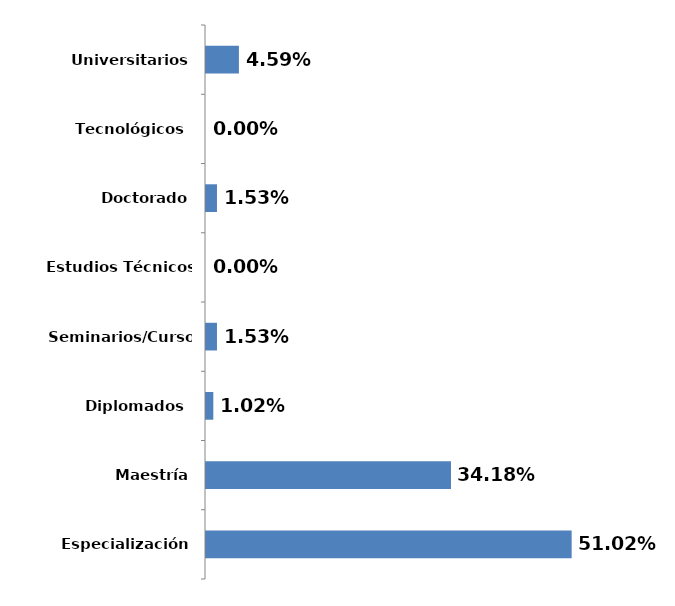
| Category | Series 0 |
|---|---|
| Especialización | 0.51 |
| Maestría | 0.342 |
| Diplomados  | 0.01 |
| Seminarios/Cursos  | 0.015 |
| Estudios Técnicos  | 0 |
| Doctorado | 0.015 |
| Tecnológicos  | 0 |
| Universitarios | 0.046 |